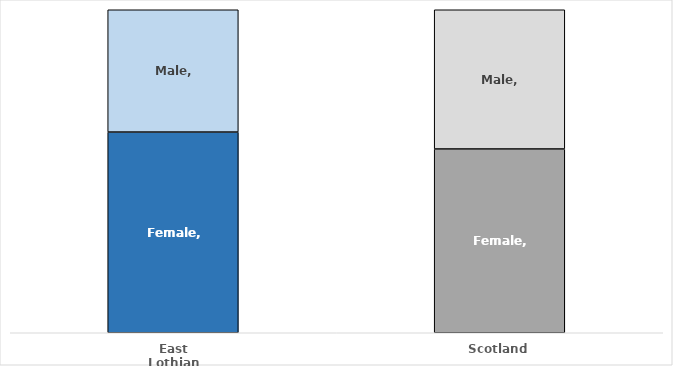
| Category | Female | Male |
|---|---|---|
| East Lothian | 0.621 | 0.379 |
| Scotland | 0.569 | 0.431 |